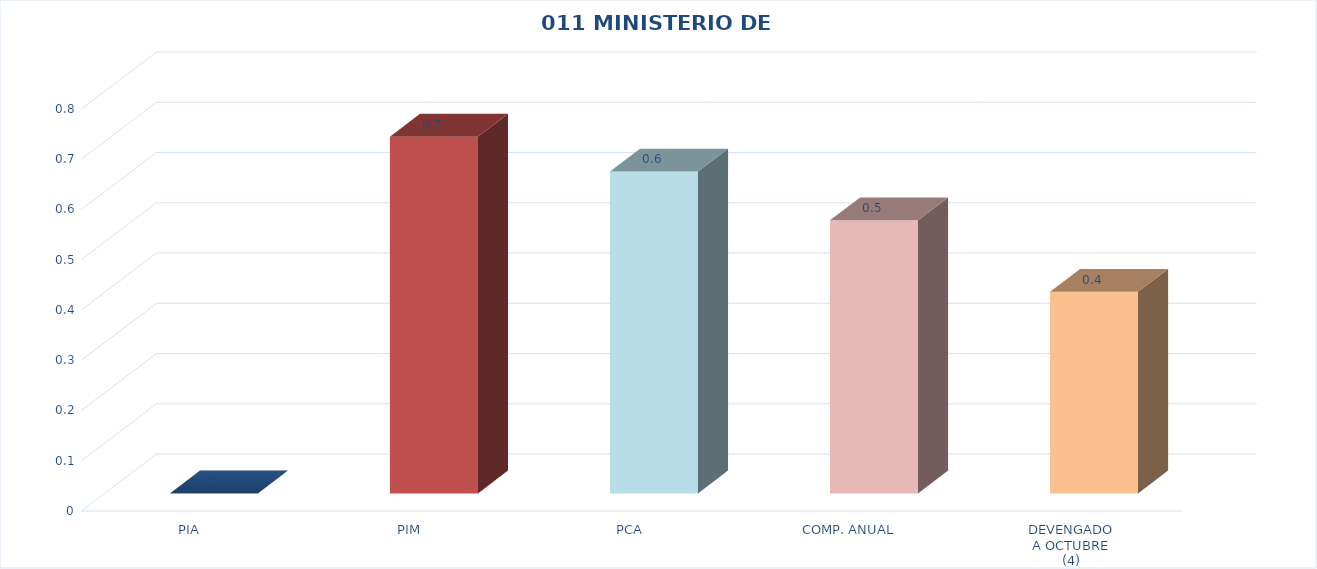
| Category | 011 MINISTERIO DE SALUD |
|---|---|
| PIA | 0 |
| PIM | 0.71 |
| PCA | 0.641 |
| COMP. ANUAL | 0.543 |
| DEVENGADO
A OCTUBRE
(4) | 0.401 |